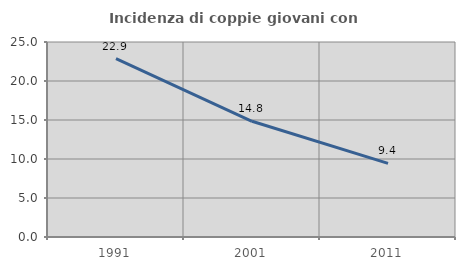
| Category | Incidenza di coppie giovani con figli |
|---|---|
| 1991.0 | 22.86 |
| 2001.0 | 14.837 |
| 2011.0 | 9.436 |